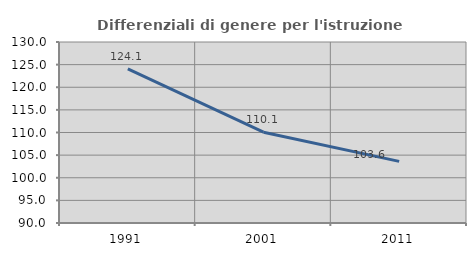
| Category | Differenziali di genere per l'istruzione superiore |
|---|---|
| 1991.0 | 124.058 |
| 2001.0 | 110.067 |
| 2011.0 | 103.625 |